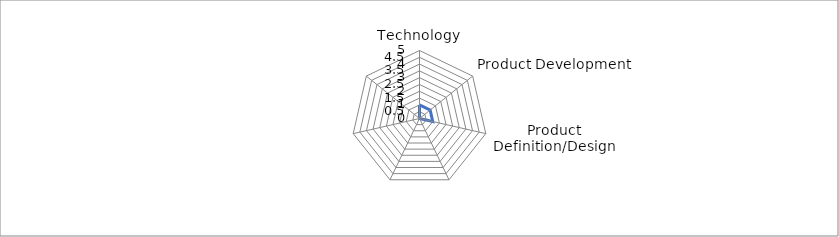
| Category | Series 0 |
|---|---|
| Technology | 1 |
| Product Development | 1 |
| Product Definition/Design | 1 |